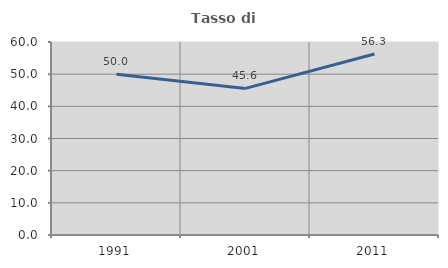
| Category | Tasso di occupazione   |
|---|---|
| 1991.0 | 50 |
| 2001.0 | 45.578 |
| 2011.0 | 56.25 |